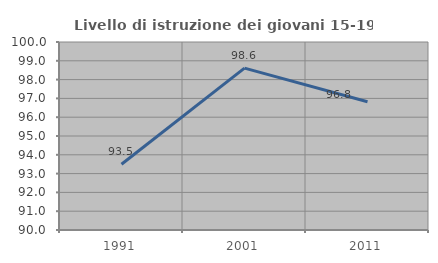
| Category | Livello di istruzione dei giovani 15-19 anni |
|---|---|
| 1991.0 | 93.496 |
| 2001.0 | 98.611 |
| 2011.0 | 96.825 |